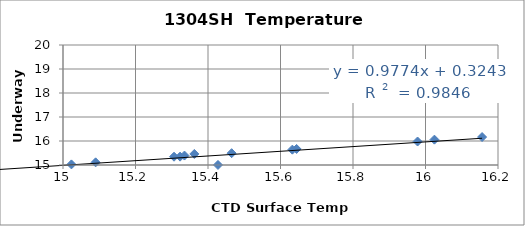
| Category | Series 0 |
|---|---|
| 14.7186 | 15.332 |
| 15.4275 | 15.002 |
| 15.6444 | 15.669 |
| 16.0246 | 16.056 |
| 15.9781 | 15.978 |
| 15.3063 | 15.346 |
| 14.6689 | 14.713 |
| 14.3321 | 14.316 |
| 15.4652 | 15.493 |
| 15.09 | 15.11 |
| 14.2213 | 14.291 |
| 15.3623 | 15.46 |
| 14.9193 | 14.966 |
| 13.678 | 13.33 |
| 14.7478 | 14.581 |
| 14.2386 | 14.288 |
| 12.4286 | 12.499 |
| 14.5231 | 14.587 |
| 13.3308 | 13.512 |
| 14.1272 | 14.26 |
| 13.4601 | 13.465 |
| 14.1752 | 14.185 |
| 15.0647 | 14.08 |
| 14.314 | 14.332 |
| 14.7946 | 14.797 |
| 16.1561 | 16.164 |
| 15.6327 | 15.64 |
| 15.0232 | 15.025 |
| 15.323 | 15.348 |
| 14.7024 | 14.701 |
| 14.3312 | 14.31 |
| 13.4914 | 13.51 |
| 13.085 | 13.101 |
| 12.7637 | 12.756 |
| 12.5017 | 12.524 |
| 11.9197 | 11.945 |
| 13.2303 | 13.181 |
| 13.1284 | 13.176 |
| 13.3522 | 13.418 |
| 12.1922 | 12.19 |
| 10.5775 | 10.602 |
| 11.6146 | 11.604 |
| 13.1504 | 13.174 |
| 13.3904 | 13.41 |
| 13.7743 | 13.808 |
| 15.3351 | 15.394 |
| 14.9519 | 14.978 |
| 13.81 | 13.817 |
| 13.6855 | 13.694 |
| 13.332 | 13.36 |
| 12.6902 | 12.727 |
| 12.5579 | 12.633 |
| 11.0716 | 11.328 |
| 10.7037 | 10.759 |
| 12.005 | 12.037 |
| 11.8763 | 11.9 |
| 12.9472 | 12.982 |
| 13.6129 | 13.62 |
| 14.1178 | 14.124 |
| 13.3258 | 13.351 |
| 12.5487 | 12.573 |
| 11.6543 | 12.138 |
| 11.5548 | 11.328 |
| 11.093 | 11.22 |
| 10.6232 | 10.636 |
| 12.1615 | 12.19 |
| 12.4363 | 12.539 |
| 12.4607 | 12.477 |